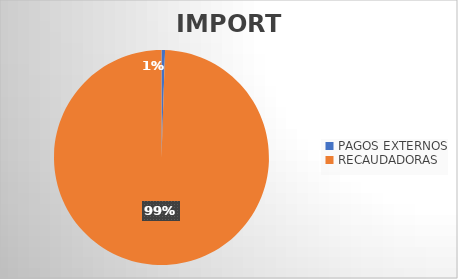
| Category | IMPORTE |
|---|---|
| PAGOS EXTERNOS | 1013130.9 |
| RECAUDADORAS | 190189845.02 |